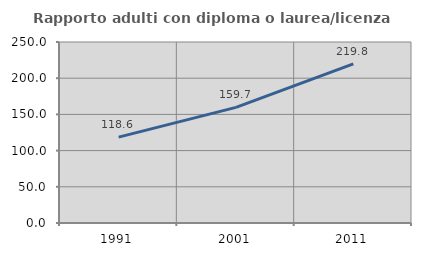
| Category | Rapporto adulti con diploma o laurea/licenza media  |
|---|---|
| 1991.0 | 118.583 |
| 2001.0 | 159.672 |
| 2011.0 | 219.847 |